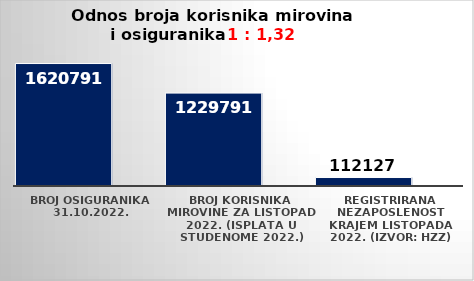
| Category | Series 0 | Series 1 |
|---|---|---|
| Broj osiguranika 31.10.2022. | 1620791 |  |
| Broj korisnika mirovine za listopad 2022. (isplata u studenome 2022.) | 1229791 |  |
| Registrirana nezaposlenost krajem listopada 2022. (izvor: HZZ) | 112127 |  |